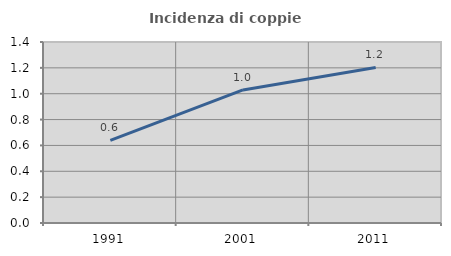
| Category | Incidenza di coppie miste |
|---|---|
| 1991.0 | 0.639 |
| 2001.0 | 1.029 |
| 2011.0 | 1.203 |